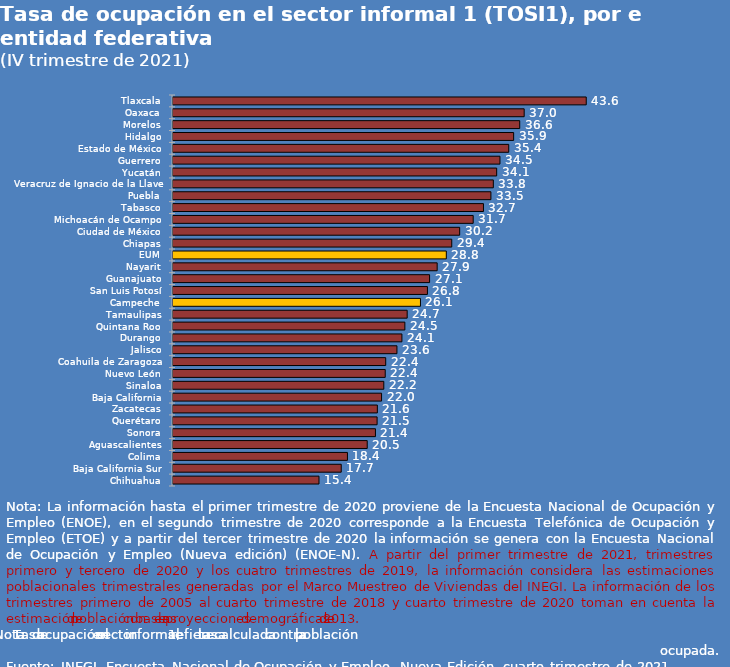
| Category | Series 0 |
|---|---|
| Tlaxcala | 43.591 |
| Oaxaca | 37.044 |
| Morelos | 36.574 |
| Hidalgo | 35.933 |
| Estado de México | 35.415 |
| Guerrero | 34.489 |
| Yucatán | 34.143 |
| Veracruz de Ignacio de la Llave | 33.79 |
| Puebla | 33.536 |
| Tabasco | 32.749 |
| Michoacán de Ocampo | 31.667 |
| Ciudad de México | 30.24 |
| Chiapas | 29.405 |
| EUM | 28.831 |
| Nayarit | 27.865 |
| Guanajuato | 27.066 |
| San Luis Potosí | 26.838 |
| Campeche | 26.103 |
| Tamaulipas | 24.702 |
| Quintana Roo | 24.459 |
| Durango | 24.147 |
| Jalisco | 23.622 |
| Coahuila de Zaragoza | 22.439 |
| Nuevo León | 22.387 |
| Sinaloa | 22.237 |
| Baja California | 22.001 |
| Zacatecas | 21.555 |
| Querétaro | 21.53 |
| Sonora | 21.355 |
| Aguascalientes | 20.488 |
| Colima | 18.402 |
| Baja California Sur | 17.747 |
| Chihuahua | 15.4 |